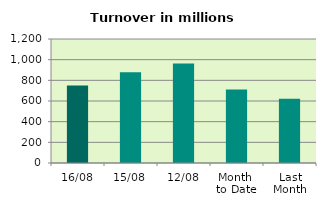
| Category | Series 0 |
|---|---|
| 16/08 | 749.73 |
| 15/08 | 879.358 |
| 12/08 | 961.897 |
| Month 
to Date | 711.984 |
| Last
Month | 622.259 |